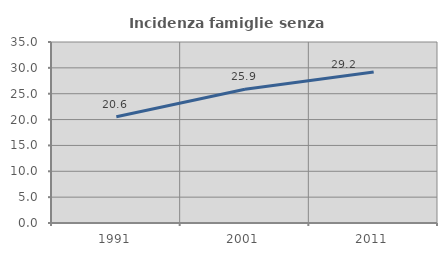
| Category | Incidenza famiglie senza nuclei |
|---|---|
| 1991.0 | 20.563 |
| 2001.0 | 25.88 |
| 2011.0 | 29.213 |